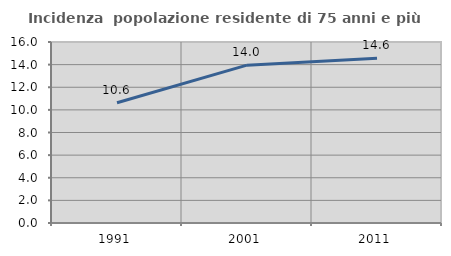
| Category | Incidenza  popolazione residente di 75 anni e più |
|---|---|
| 1991.0 | 10.628 |
| 2001.0 | 13.952 |
| 2011.0 | 14.571 |